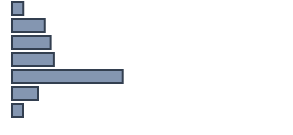
| Category | Series 0 |
|---|---|
| 0 | 4.1 |
| 1 | 12 |
| 2 | 14.2 |
| 3 | 15.4 |
| 4 | 40.7 |
| 5 | 9.6 |
| 6 | 4 |